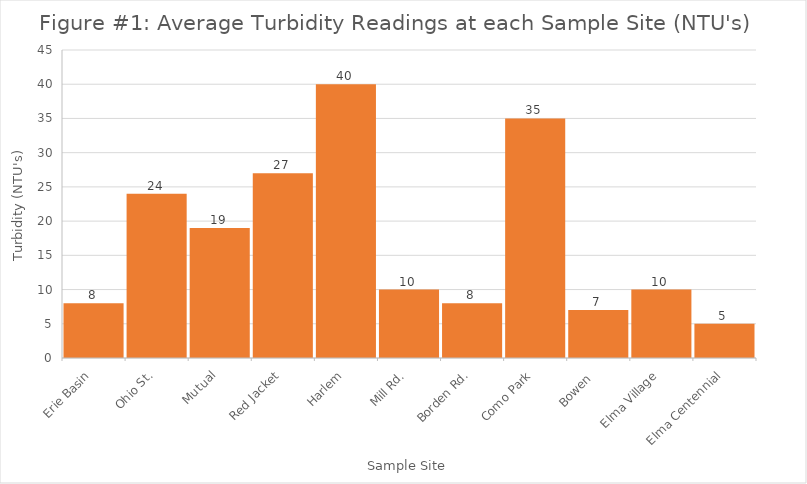
| Category | Erie Basin |
|---|---|
| Erie Basin | 8 |
| Ohio St. | 24 |
| Mutual | 19 |
| Red Jacket | 27 |
| Harlem | 40 |
| Mill Rd. | 10 |
| Borden Rd. | 8 |
| Como Park | 35 |
| Bowen  | 7 |
| Elma Village | 10 |
| Elma Centennial | 5 |